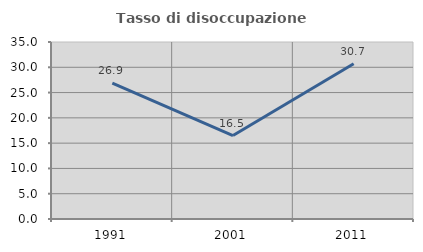
| Category | Tasso di disoccupazione giovanile  |
|---|---|
| 1991.0 | 26.87 |
| 2001.0 | 16.497 |
| 2011.0 | 30.704 |